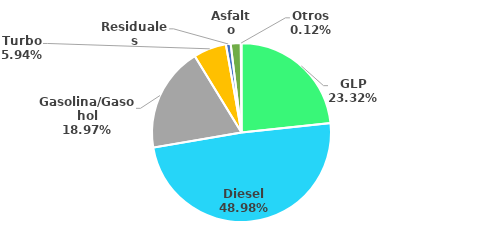
| Category | MBPD |
|---|---|
| GLP | 64.317 |
| Diesel | 135.085 |
| Gasolina/Gasohol | 52.311 |
| Turbo | 16.38 |
| Residuales | 2.371 |
| Asfalto | 5.01 |
| Otros | 0.34 |